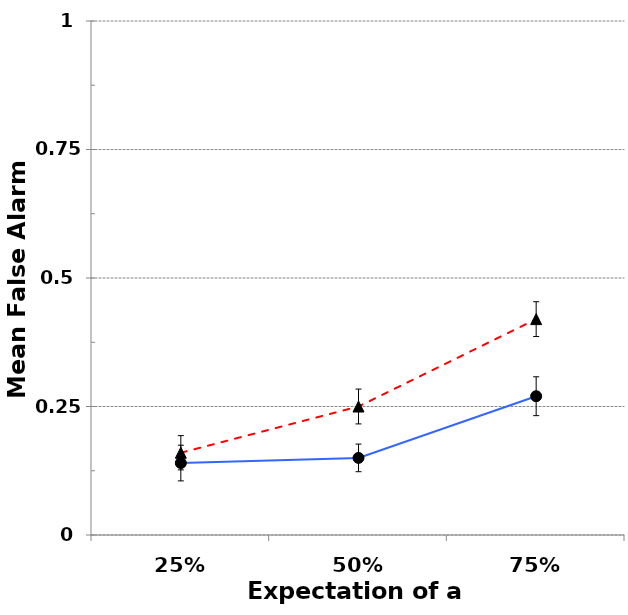
| Category | Series1 | Series2 |
|---|---|---|
| 25% | 0.14 | 0.16 |
| 50% | 0.15 | 0.25 |
| 75% | 0.27 | 0.42 |